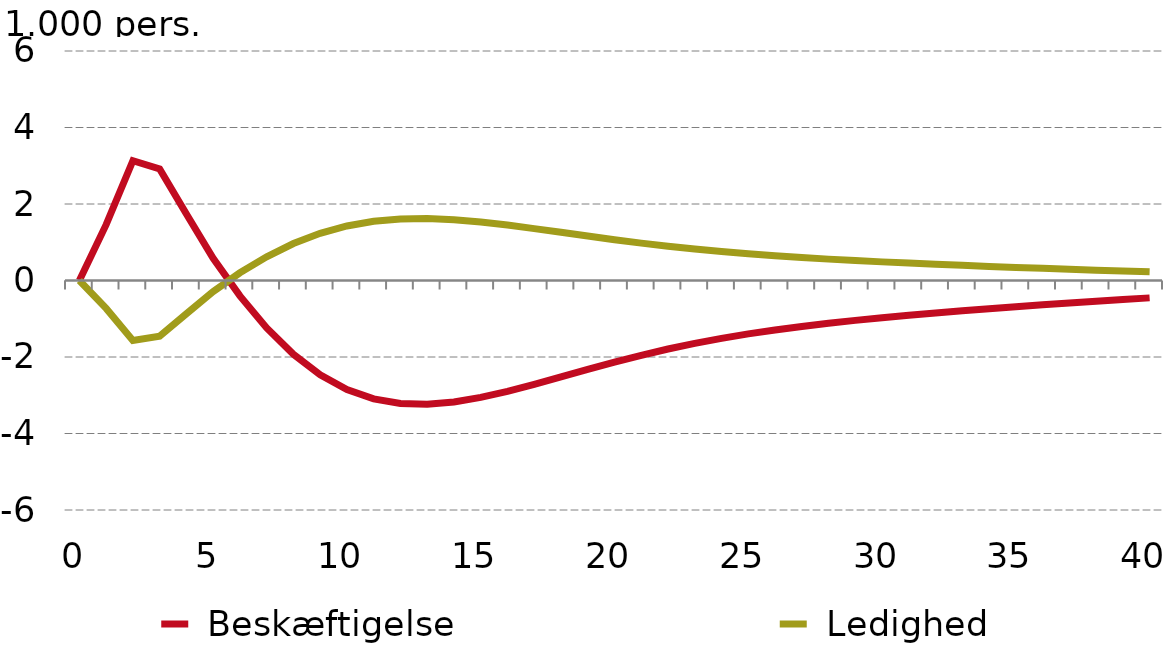
| Category |  Beskæftigelse |  Ledighed |
|---|---|---|
| 0.0 | 0 | 0 |
| nan | 1.46 | -0.73 |
| nan | 3.133 | -1.567 |
| nan | 2.916 | -1.458 |
| nan | 1.738 | -0.869 |
| 5.0 | 0.579 | -0.289 |
| nan | -0.402 | 0.201 |
| nan | -1.239 | 0.619 |
| nan | -1.931 | 0.965 |
| nan | -2.468 | 1.234 |
| 10.0 | -2.851 | 1.426 |
| nan | -3.094 | 1.547 |
| nan | -3.215 | 1.608 |
| nan | -3.235 | 1.618 |
| nan | -3.176 | 1.588 |
| 15.0 | -3.057 | 1.529 |
| nan | -2.898 | 1.449 |
| nan | -2.714 | 1.357 |
| nan | -2.519 | 1.259 |
| nan | -2.322 | 1.161 |
| 20.0 | -2.133 | 1.066 |
| nan | -1.955 | 0.977 |
| nan | -1.792 | 0.896 |
| nan | -1.644 | 0.822 |
| nan | -1.513 | 0.756 |
| 25.0 | -1.396 | 0.698 |
| nan | -1.292 | 0.646 |
| nan | -1.2 | 0.6 |
| nan | -1.118 | 0.559 |
| nan | -1.043 | 0.521 |
| 30.0 | -0.974 | 0.487 |
| nan | -0.91 | 0.455 |
| nan | -0.85 | 0.425 |
| nan | -0.793 | 0.396 |
| nan | -0.738 | 0.369 |
| 35.0 | -0.685 | 0.343 |
| nan | -0.635 | 0.317 |
| nan | -0.586 | 0.293 |
| nan | -0.54 | 0.27 |
| nan | -0.496 | 0.248 |
| 40.0 | -0.454 | 0.227 |